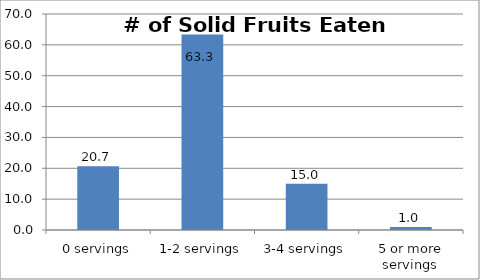
| Category | Series 0 |
|---|---|
| 0 servings | 20.669 |
| 1-2 servings | 63.339 |
| 3-4 servings | 15.018 |
| 5 or more servings | 0.974 |